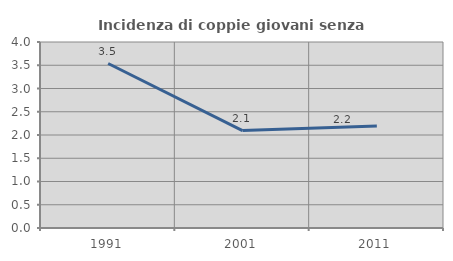
| Category | Incidenza di coppie giovani senza figli |
|---|---|
| 1991.0 | 3.537 |
| 2001.0 | 2.094 |
| 2011.0 | 2.191 |